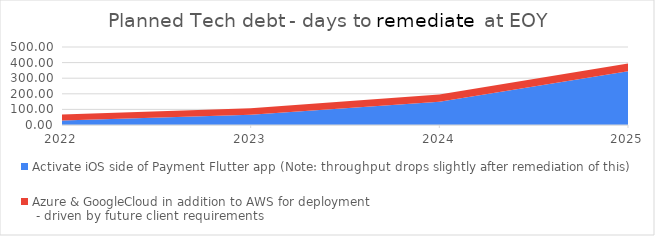
| Category | Activate iOS side of Payment Flutter app (Note: throughput drops slightly after remediation of this) | Azure & GoogleCloud in addition to AWS for deployment
 - driven by future client requirements |
|---|---|---|
| 2022-12-31 23:59:59 | 28.324 | 38.789 |
| 2023-12-31 23:59:59 | 65.146 | 42.114 |
| 2024-12-31 23:59:59 | 149.836 | 45.724 |
| 2025-12-31 23:59:59 | 344.622 | 49.643 |